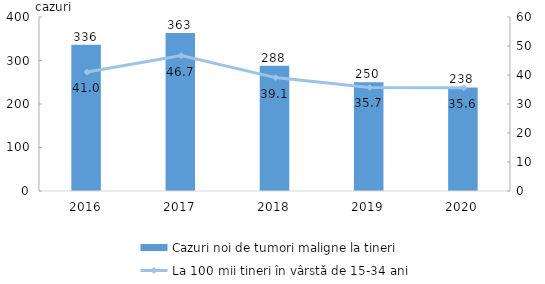
| Category | Cazuri noi de tumori maligne la tineri |
|---|---|
| 2016.0 | 336 |
| 2017.0 | 363 |
| 2018.0 | 288 |
| 2019.0 | 250 |
| 2020.0 | 238 |